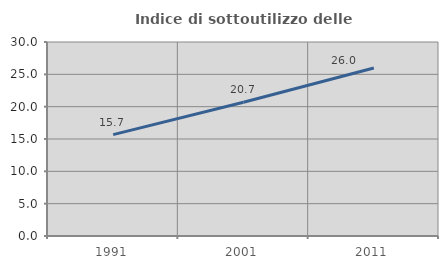
| Category | Indice di sottoutilizzo delle abitazioni  |
|---|---|
| 1991.0 | 15.681 |
| 2001.0 | 20.672 |
| 2011.0 | 25.991 |